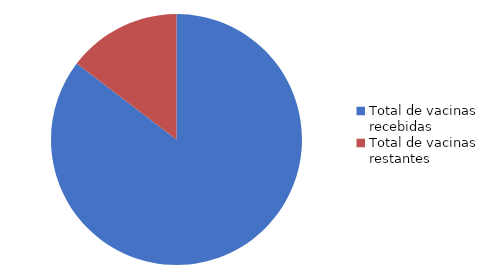
| Category | Series 0 |
|---|---|
| Total de vacinas recebidas | 69025 |
| Total de vacinas restantes | 11834 |